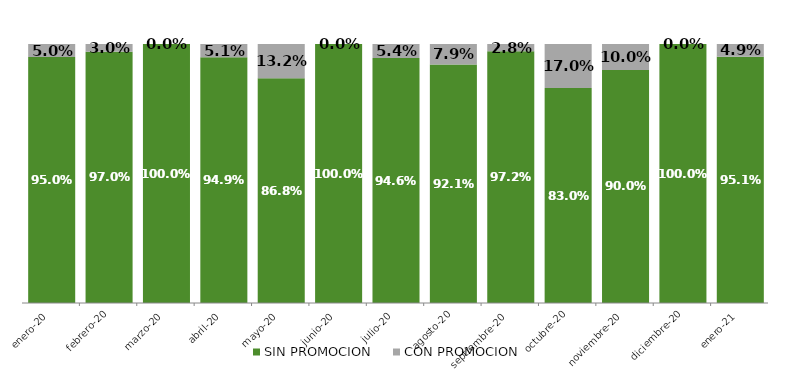
| Category | SIN PROMOCION   | CON PROMOCION   |
|---|---|---|
| 2020-01-01 | 0.95 | 0.05 |
| 2020-02-01 | 0.97 | 0.03 |
| 2020-03-01 | 1 | 0 |
| 2020-04-01 | 0.949 | 0.051 |
| 2020-05-01 | 0.868 | 0.132 |
| 2020-06-01 | 1 | 0 |
| 2020-07-01 | 0.946 | 0.054 |
| 2020-08-01 | 0.921 | 0.079 |
| 2020-09-01 | 0.972 | 0.028 |
| 2020-10-01 | 0.83 | 0.17 |
| 2020-11-01 | 0.9 | 0.1 |
| 2020-12-01 | 1 | 0 |
| 2021-01-01 | 0.951 | 0.049 |